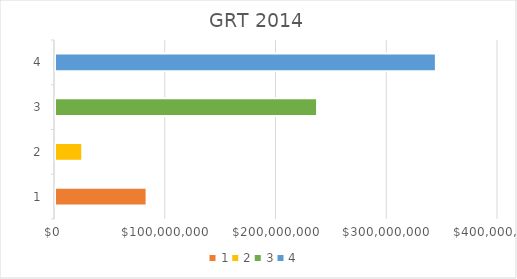
| Category | Series 0 |
|---|---|
| 0 | 82714388.49 |
| 1 | 24543080.04 |
| 2 | 236643496.92 |
| 3 | 343900965.45 |